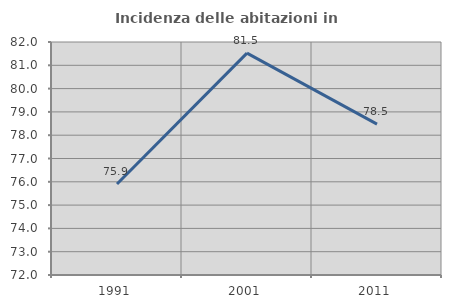
| Category | Incidenza delle abitazioni in proprietà  |
|---|---|
| 1991.0 | 75.904 |
| 2001.0 | 81.522 |
| 2011.0 | 78.477 |